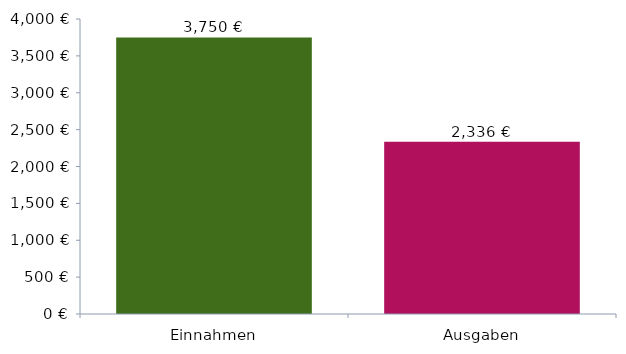
| Category | Diagrammdaten |
|---|---|
| 0 | 3750 |
| 1 | 2336 |